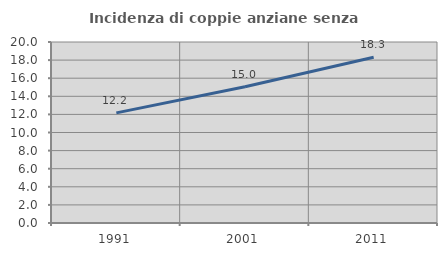
| Category | Incidenza di coppie anziane senza figli  |
|---|---|
| 1991.0 | 12.166 |
| 2001.0 | 15.046 |
| 2011.0 | 18.308 |